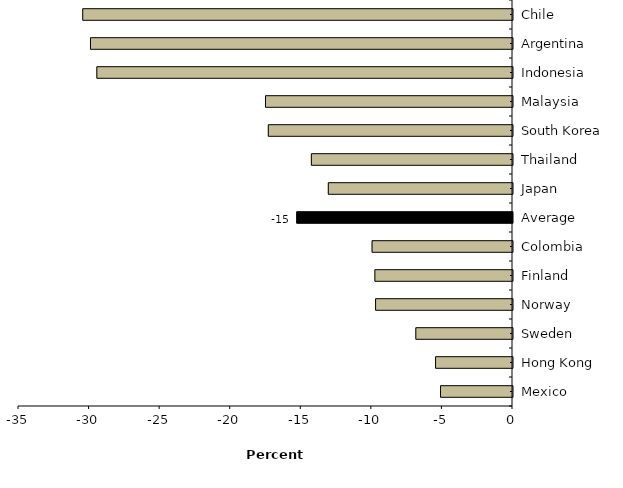
| Category | Series 0 |
|---|---|
| Mexico | -5.1 |
| Hong Kong | -5.45 |
| Sweden | -6.85 |
| Norway | -9.7 |
| Finland | -9.75 |
| Colombia | -9.95 |
| Average | -15.285 |
| Japan | -13.05 |
| Thailand | -14.25 |
| South Korea | -17.3 |
| Malaysia | -17.5 |
| Indonesia | -29.45 |
| Argentina | -29.9 |
| Chile | -30.45 |